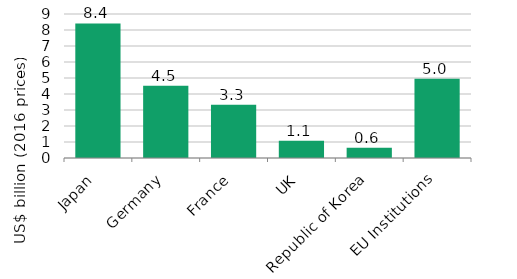
| Category | Series 0 |
|---|---|
| Japan | 8410.349 |
| Germany | 4514.095 |
| France | 3333.924 |
| UK | 1085.587 |
| Republic of Korea | 637.444 |
| EU Institutions | 4950.559 |